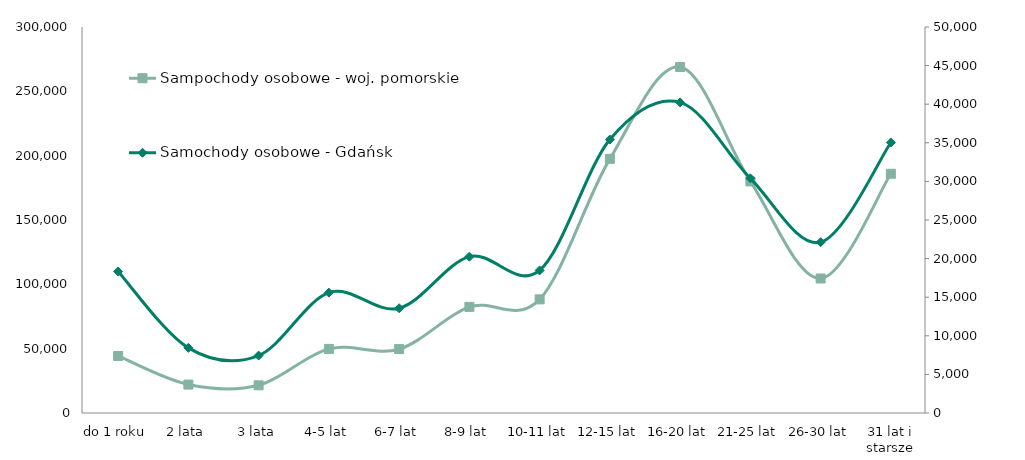
| Category | Sampochody osobowe - woj. pomorskie |
|---|---|
| do 1 roku | 44327 |
| 2 lata | 22083 |
| 3 lata | 21511 |
| 4-5 lat | 49803 |
| 6-7 lat | 49647 |
| 8-9 lat | 82473 |
| 10-11 lat | 88324 |
| 12-15 lat | 197521 |
| 16-20 lat | 268897 |
| 21-25 lat | 179970 |
| 26-30 lat | 104549 |
| 31 lat i starsze | 185943 |